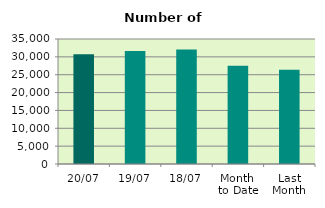
| Category | Series 0 |
|---|---|
| 20/07 | 30710 |
| 19/07 | 31620 |
| 18/07 | 32076 |
| Month 
to Date | 27501.143 |
| Last
Month | 26399.455 |